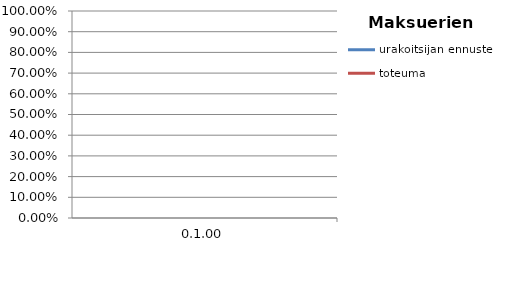
| Category | urakoitsijan ennuste | toteuma |
|---|---|---|
| 0.0 | 0 | 0 |
| 0.0 | 0 | 0 |
| 0.0 | 0 | 0 |
| 0.0 | 0 | 0 |
| 0.0 | 0 | 0 |
| 0.0 | 0 | 0 |
| 0.0 | 0 | 0 |
| 0.0 | 0 | 0 |
| 0.0 | 0 | 0 |
| 0.0 | 0 | 0 |
| 0.0 | 0 | 0 |
| 0.0 | 0 | 0 |
| 0.0 | 0 | 0 |
| 0.0 | 0 | 0 |
| 0.0 | 0 | 0 |
| 0.0 | 0 | 0 |
| 0.0 | 0 | 0 |
| 0.0 | 0 | 0 |
| 0.0 | 0 | 0 |
| 0.0 | 0 | 0 |
| 0.0 | 0 | 0 |
| 0.0 | 0 | 0 |
| 0.0 | 0 | 0 |
| 0.0 | 0 | 0 |
| 0.0 | 0 | 0 |
| 0.0 | 0 | 0 |
| 0.0 | 0 | 0 |
| 0.0 | 0 | 0 |
| 0.0 | 0 | 0 |
| 0.0 | 0 | 0 |
| 0.0 | 0 | 0 |
| 0.0 | 0 | 0 |
| 0.0 | 0 | 0 |
| 0.0 | 0 | 0 |
| 0.0 | 0 | 0 |
| 0.0 | 0 | 0 |
| 0.0 | 0 | 0 |
| 0.0 | 0 | 0 |
| 0.0 | 0 | 0 |
| 0.0 | 0 | 0 |
| 0.0 | 0 | 0 |
| 0.0 | 0 | 0 |
| 0.0 | 0 | 0 |
| 0.0 | 0 | 0 |
| 0.0 | 0 | 0 |
| 0.0 | 0 | 0 |
| 0.0 | 0 | 0 |
| 0.0 | 0 | 0 |
| 0.0 | 0 | 0 |
| 0.0 | 0 | 0 |
| 0.0 | 0 | 0 |
| 0.0 | 0 | 0 |
| 0.0 | 0 | 0 |
| 0.0 | 0 | 0 |
| 0.0 | 0 | 0 |
| 0.0 | 0 | 0 |
| 0.0 | 0 | 0 |
| 0.0 | 0 | 0 |
| 0.0 | 0 | 0 |
| 0.0 | 0 | 0 |
| 0.0 | 0 | 0 |
| 0.0 | 0 | 0 |
| 0.0 | 0 | 0 |
| 0.0 | 0 | 0 |
| 0.0 | 0 | 0 |
| 0.0 | 0 | 0 |
| 0.0 | 0 | 0 |
| 0.0 | 0 | 0 |
| 0.0 | 0 | 0 |
| 0.0 | 0 | 0 |
| 0.0 | 0 | 0 |
| 0.0 | 0 | 0 |
| 0.0 | 0 | 0 |
| 0.0 | 0 | 0 |
| 0.0 | 0 | 0 |
| 0.0 | 0 | 0 |
| 0.0 | 0 | 0 |
| 0.0 | 0 | 0 |
| 0.0 | 0 | 0 |
| 0.0 | 0 | 0 |
| 0.0 | 0 | 0 |
| 0.0 | 0 | 0 |
| 0.0 | 0 | 0 |
| 0.0 | 0 | 0 |
| 0.0 | 0 | 0 |
| 0.0 | 0 | 0 |
| 0.0 | 0 | 0 |
| 0.0 | 0 | 0 |
| 0.0 | 0 | 0 |
| 0.0 | 0 | 0 |
| 0.0 | 0 | 0 |
| 0.0 | 0 | 0 |
| 0.0 | 0 | 0 |
| 0.0 | 0 | 0 |
| 0.0 | 0 | 0 |
| 0.0 | 0 | 0 |
| 0.0 | 0 | 0 |
| 0.0 | 0 | 0 |
| 0.0 | 0 | 0 |
| 0.0 | 0 | 0 |
| 0.0 | 0 | 0 |
| 0.0 | 0 | 0 |
| 0.0 | 0 | 0 |
| 0.0 | 0 | 0 |
| 0.0 | 0 | 0 |
| 0.0 | 0 | 0 |
| 0.0 | 0 | 0 |
| 0.0 | 0 | 0 |
| 0.0 | 0 | 0 |
| 0.0 | 0 | 0 |
| 0.0 | 0 | 0 |
| 0.0 | 0 | 0 |
| 0.0 | 0 | 0 |
| 0.0 | 0 | 0 |
| 0.0 | 0 | 0 |
| 0.0 | 0 | 0 |
| 0.0 | 0 | 0 |
| 0.0 | 0 | 0 |
| 0.0 | 0 | 0 |
| 0.0 | 0 | 0 |
| 0.0 | 0 | 0 |
| 0.0 | 0 | 0 |
| 0.0 | 0 | 0 |
| 0.0 | 0 | 0 |
| 0.0 | 0 | 0 |
| 0.0 | 0 | 0 |
| 0.0 | 0 | 0 |
| 0.0 | 0 | 0 |
| 0.0 | 0 | 0 |
| 0.0 | 0 | 0 |
| 0.0 | 0 | 0 |
| 0.0 | 0 | 0 |
| 0.0 | 0 | 0 |
| 0.0 | 0 | 0 |
| 0.0 | 0 | 0 |
| 0.0 | 0 | 0 |
| 0.0 | 0 | 0 |
| 0.0 | 0 | 0 |
| 0.0 | 0 | 0 |
| 0.0 | 0 | 0 |
| 0.0 | 0 | 0 |
| 0.0 | 0 | 0 |
| 0.0 | 0 | 0 |
| 0.0 | 0 | 0 |
| 0.0 | 0 | 0 |
| 0.0 | 0 | 0 |
| 0.0 | 0 | 0 |
| 0.0 | 0 | 0 |
| 0.0 | 0 | 0 |
| 0.0 | 0 | 0 |
| 0.0 | 0 | 0 |
| 0.0 | 0 | 0 |
| 0.0 | 0 | 0 |
| 0.0 | 0 | 0 |
| 0.0 | 0 | 0 |
| 0.0 | 0 | 0 |
| 0.0 | 0 | 0 |
| 0.0 | 0 | 0 |
| 0.0 | 0 | 0 |
| 0.0 | 0 | 0 |
| 0.0 | 0 | 0 |
| 0.0 | 0 | 0 |
| 0.0 | 0 | 0 |
| 0.0 | 0 | 0 |
| 0.0 | 0 | 0 |
| 0.0 | 0 | 0 |
| 0.0 | 0 | 0 |
| 0.0 | 0 | 0 |
| 0.0 | 0 | 0 |
| 0.0 | 0 | 0 |
| 0.0 | 0 | 0 |
| 0.0 | 0 | 0 |
| 0.0 | 0 | 0 |
| 0.0 | 0 | 0 |
| 0.0 | 0 | 0 |
| 0.0 | 0 | 0 |
| 0.0 | 0 | 0 |
| 0.0 | 0 | 0 |
| 0.0 | 0 | 0 |
| 0.0 | 0 | 0 |
| 0.0 | 0 | 0 |
| 0.0 | 0 | 0 |
| 0.0 | 0 | 0 |
| 0.0 | 0 | 0 |
| 0.0 | 0 | 0 |
| 0.0 | 0 | 0 |
| 0.0 | 0 | 0 |